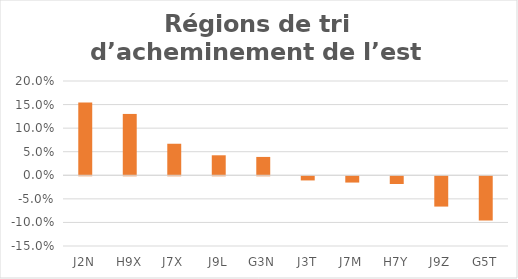
| Category | Series 0 |
|---|---|
| J2N | 0.155 |
| H9X | 0.13 |
| J7X | 0.067 |
| J9L | 0.042 |
| G3N | 0.039 |
| J3T | -0.009 |
| J7M | -0.013 |
| H7Y | -0.016 |
| J9Z | -0.064 |
| G5T | -0.094 |